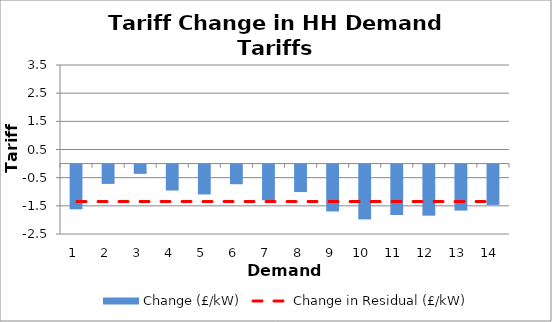
| Category | Change (£/kW) |
|---|---|
| 1.0 | -1.587 |
| 2.0 | -0.686 |
| 3.0 | -0.33 |
| 4.0 | -0.922 |
| 5.0 | -1.06 |
| 6.0 | -0.697 |
| 7.0 | -1.266 |
| 8.0 | -0.976 |
| 9.0 | -1.663 |
| 10.0 | -1.946 |
| 11.0 | -1.789 |
| 12.0 | -1.814 |
| 13.0 | -1.633 |
| 14.0 | -1.432 |